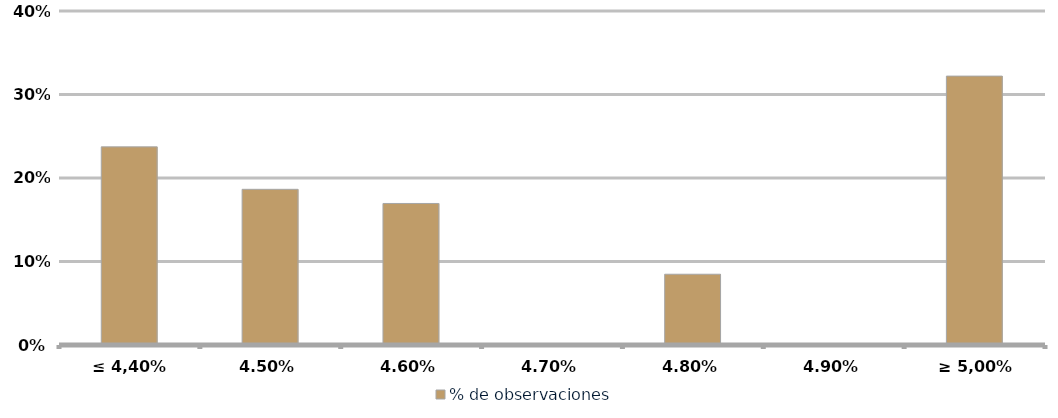
| Category | % de observaciones  |
|---|---|
| ≤ 4,40% | 0.237 |
| 4,50% | 0.186 |
| 4,60% | 0.169 |
| 4,70% | 0 |
| 4,80% | 0.085 |
| 4,90% | 0 |
| ≥ 5,00% | 0.322 |